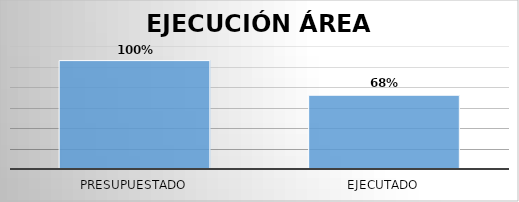
| Category | Series 0 |
|---|---|
| Presupuestado | 26438745722 |
| Ejecutado | 17993419404 |